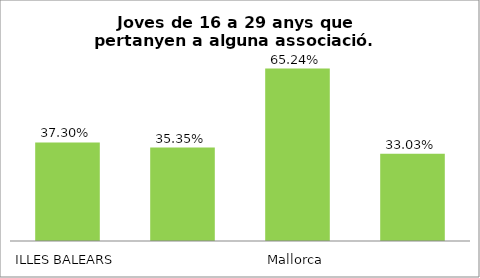
| Category | Series 0 |
|---|---|
| ILLES BALEARS | 0.373 |
| Mallorca | 0.354 |
| Menorca | 0.652 |
| Eivissa-Formentera | 0.33 |